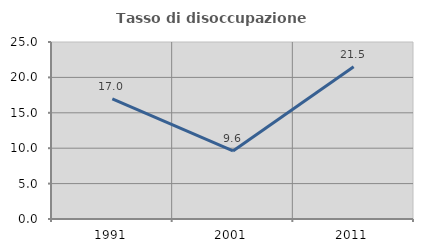
| Category | Tasso di disoccupazione giovanile  |
|---|---|
| 1991.0 | 16.958 |
| 2001.0 | 9.615 |
| 2011.0 | 21.519 |